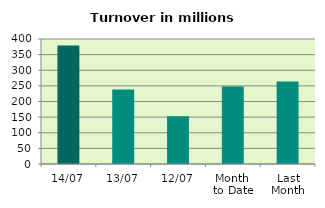
| Category | Series 0 |
|---|---|
| 14/07 | 379.26 |
| 13/07 | 238.02 |
| 12/07 | 152.587 |
| Month 
to Date | 248.126 |
| Last
Month | 264.074 |